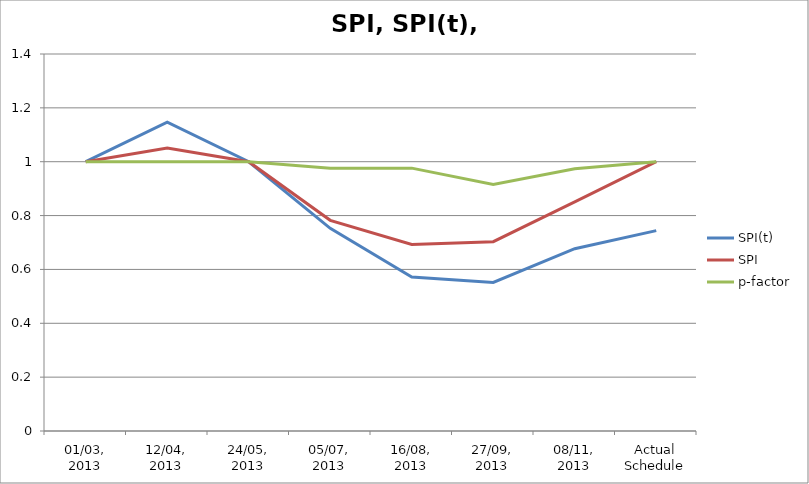
| Category | SPI(t) | SPI | p-factor |
|---|---|---|---|
| 01/03, 2013 | 1 | 1 | 1 |
| 12/04, 2013 | 1.147 | 1.051 | 1 |
| 24/05, 2013 | 1 | 1 | 1 |
| 05/07, 2013 | 0.753 | 0.782 | 0.976 |
| 16/08, 2013 | 0.572 | 0.692 | 0.976 |
| 27/09, 2013 | 0.552 | 0.703 | 0.915 |
| 08/11, 2013 | 0.677 | 0.851 | 0.974 |
| Actual Schedule | 0.744 | 1 | 1 |